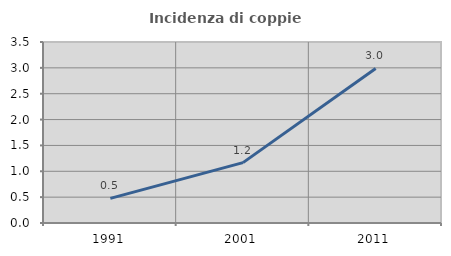
| Category | Incidenza di coppie miste |
|---|---|
| 1991.0 | 0.476 |
| 2001.0 | 1.168 |
| 2011.0 | 2.989 |